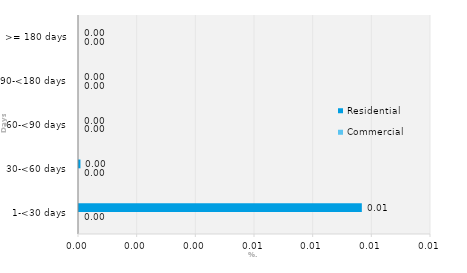
| Category | Commercial | Residential |
|---|---|---|
| 1-<30 days | 0 | 0.01 |
| 30-<60 days | 0 | 0 |
| 60-<90 days | 0 | 0 |
| 90-<180 days | 0 | 0 |
| >= 180 days | 0 | 0 |